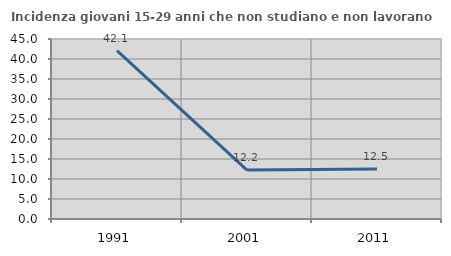
| Category | Incidenza giovani 15-29 anni che non studiano e non lavorano  |
|---|---|
| 1991.0 | 42.09 |
| 2001.0 | 12.245 |
| 2011.0 | 12.5 |